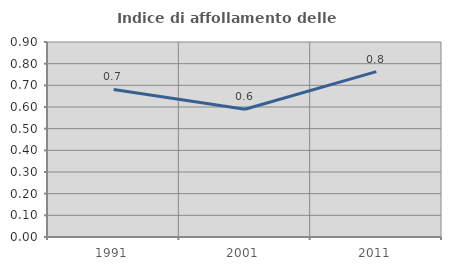
| Category | Indice di affollamento delle abitazioni  |
|---|---|
| 1991.0 | 0.681 |
| 2001.0 | 0.59 |
| 2011.0 | 0.763 |